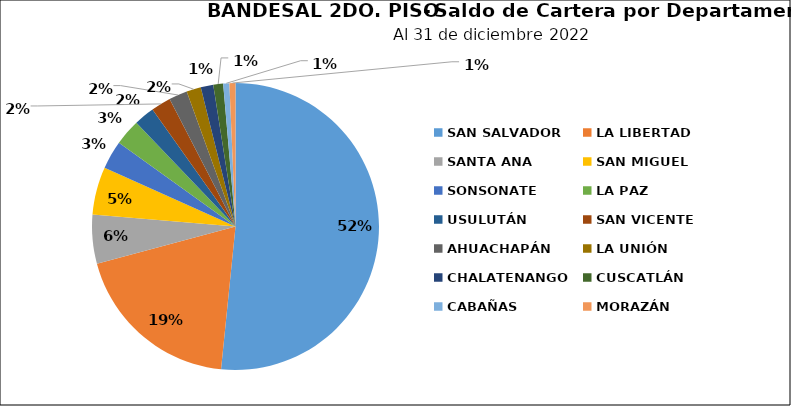
| Category | Saldo | Créditos |
|---|---|---|
| SAN SALVADOR | 218.463 | 4340 |
| LA LIBERTAD | 81.346 | 1480 |
| SANTA ANA | 23.285 | 918 |
| SAN MIGUEL | 22.871 | 1475 |
| SONSONATE | 13.496 | 673 |
| LA PAZ | 12.489 | 778 |
| USULUTÁN | 9.824 | 859 |
| SAN VICENTE | 9.418 | 483 |
| AHUACHAPÁN | 8.77 | 466 |
| LA UNIÓN | 6.876 | 412 |
| CHALATENANGO | 5.998 | 158 |
| CUSCATLÁN | 4.681 | 339 |
| CABAÑAS | 2.948 | 82 |
| MORAZÁN | 2.866 | 309 |